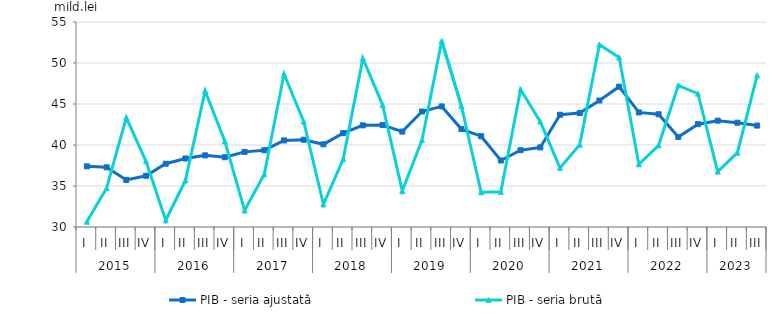
| Category | PIB - seria ajustată | PIB - seria brută |
|---|---|---|
| 0 | 37.398 | 30.647 |
| 1 | 37.282 | 34.736 |
| 2 | 35.742 | 43.347 |
| 3 | 36.248 | 38.011 |
| 4 | 37.713 | 30.82 |
| 5 | 38.356 | 35.681 |
| 6 | 38.735 | 46.605 |
| 7 | 38.51 | 40.451 |
| 8 | 39.161 | 32.024 |
| 9 | 39.368 | 36.429 |
| 10 | 40.555 | 48.654 |
| 11 | 40.646 | 42.863 |
| 12 | 40.086 | 32.776 |
| 13 | 41.448 | 38.257 |
| 14 | 42.394 | 50.555 |
| 15 | 42.433 | 44.902 |
| 16 | 41.639 | 34.401 |
| 17 | 44.084 | 40.587 |
| 18 | 44.707 | 52.682 |
| 19 | 41.939 | 44.734 |
| 20 | 41.072 | 34.239 |
| 21 | 38.113 | 34.285 |
| 22 | 39.371 | 46.761 |
| 23 | 39.705 | 42.851 |
| 24 | 43.689 | 37.212 |
| 25 | 43.895 | 40.034 |
| 26 | 45.428 | 52.235 |
| 27 | 47.115 | 50.682 |
| 28 | 43.974 | 37.647 |
| 29 | 43.751 | 39.962 |
| 30 | 40.978 | 47.265 |
| 31 | 42.542 | 46.254 |
| 32 | 42.969 | 36.76 |
| 33 | 42.721 | 39.065 |
| 34 | 42.37 | 48.505 |